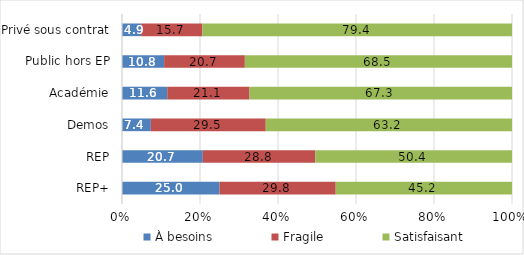
| Category | À besoins | Fragile | Satisfaisant |
|---|---|---|---|
| REP+ | 25 | 29.8 | 45.2 |
| REP | 20.7 | 28.8 | 50.4 |
| Demos | 7.4 | 29.5 | 63.2 |
| Académie | 11.6 | 21.1 | 67.3 |
| Public hors EP | 10.8 | 20.7 | 68.5 |
| Privé sous contrat | 4.9 | 15.7 | 79.4 |